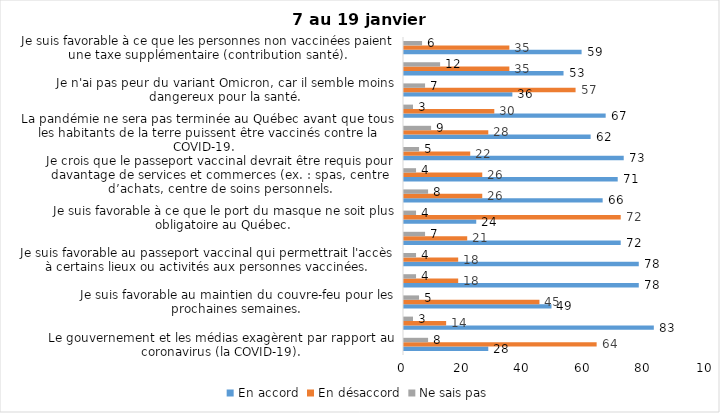
| Category | En accord | En désaccord | Ne sais pas |
|---|---|---|---|
| Le gouvernement et les médias exagèrent par rapport au coronavirus (la COVID-19). | 28 | 64 | 8 |
| J’ai peur que le système de santé soit débordé par les cas de COVID-19. | 83 | 14 | 3 |
| Je suis favorable au maintien du couvre-feu pour les prochaines semaines. | 49 | 45 | 5 |
| Je suis inquiet/inquiète que le nombre de cas augmente en raison des nouveaux variants du virus de la COVID-19. | 78 | 18 | 4 |
| Je suis favorable au passeport vaccinal qui permettrait l'accès à certains lieux ou activités aux personnes vaccinées. | 78 | 18 | 4 |
| Je suis confiant que la vaccination protège efficacement contre les variants de la COVID-19 | 72 | 21 | 7 |
| Je suis favorable à ce que le port du masque ne soit plus obligatoire au Québec. | 24 | 72 | 4 |
| J'ai peur que la reprise des cours en présentiel dans les écoles primaires et secondaires génère une augmentation des cas de COVID-19 | 66 | 26 | 8 |
| Je crois que le passeport vaccinal devrait être requis pour davantage de services et commerces (ex. : spas, centre d’achats, centre de soins personnels. | 71 | 26 | 4 |
| Les personnes non adéquatement vaccinées contre la COVID-19 sont responsables des nouveaux cas et hospitalisations et contribuent à la prolongation de la pandémie au Québec. | 73 | 22 | 5 |
| La pandémie ne sera pas terminée au Québec avant que tous les habitants de la terre puissent être vaccinés contre la COVID-19.   | 62 | 28 | 9 |
| Je suis inconfortable d’être en contact avec une personne non vaccinée contre la COVID-19 | 67 | 30 | 3 |
| Je n'ai pas peur du variant Omicron, car il semble moins dangereux pour la santé. | 36 | 57 | 7 |
| La vaccination obligatoire contre la COVID-19 mettrait fin à la pandémie. | 53 | 35 | 12 |
| Je suis favorable à ce que les personnes non vaccinées paient une taxe supplémentaire (contribution santé). | 59 | 35 | 6 |